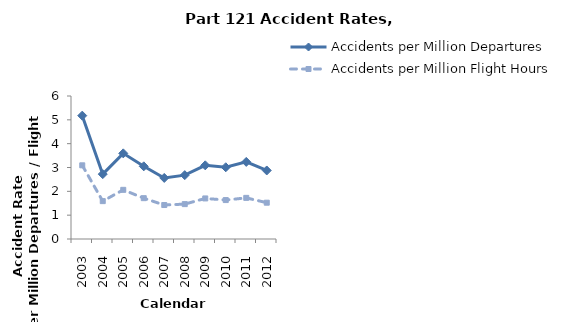
| Category | Accidents per Million Departures | Accidents per Million Flight Hours |
|---|---|---|
| 2003.0 | 5.176 | 3.091 |
| 2004.0 | 2.722 | 1.589 |
| 2005.0 | 3.594 | 2.063 |
| 2006.0 | 3.05 | 1.713 |
| 2007.0 | 2.562 | 1.426 |
| 2008.0 | 2.68 | 1.464 |
| 2009.0 | 3.091 | 1.702 |
| 2010.0 | 3.01 | 1.634 |
| 2011.0 | 3.235 | 1.726 |
| 2012.0 | 2.875 | 1.524 |